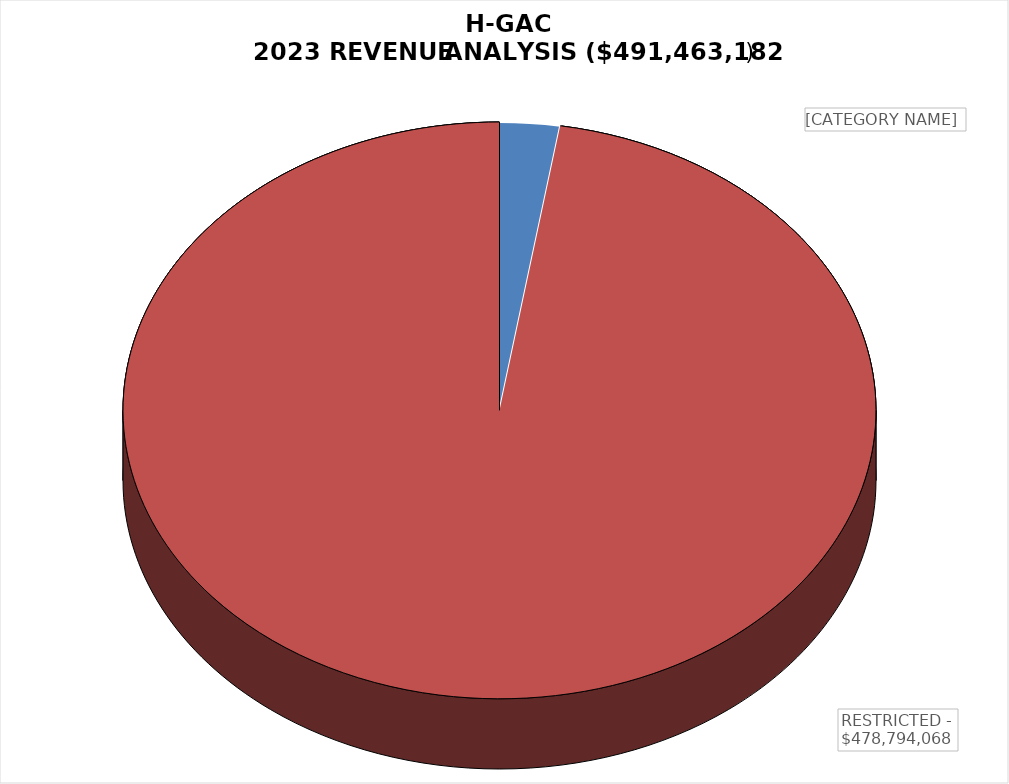
| Category | Series 0 |
|---|---|
| UNRESTRICTED - $12,669,114 | 0.026 |
| RESTRICTED - $478,794,068 | 0.974 |